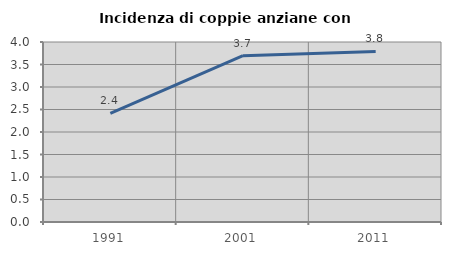
| Category | Incidenza di coppie anziane con figli |
|---|---|
| 1991.0 | 2.415 |
| 2001.0 | 3.694 |
| 2011.0 | 3.791 |